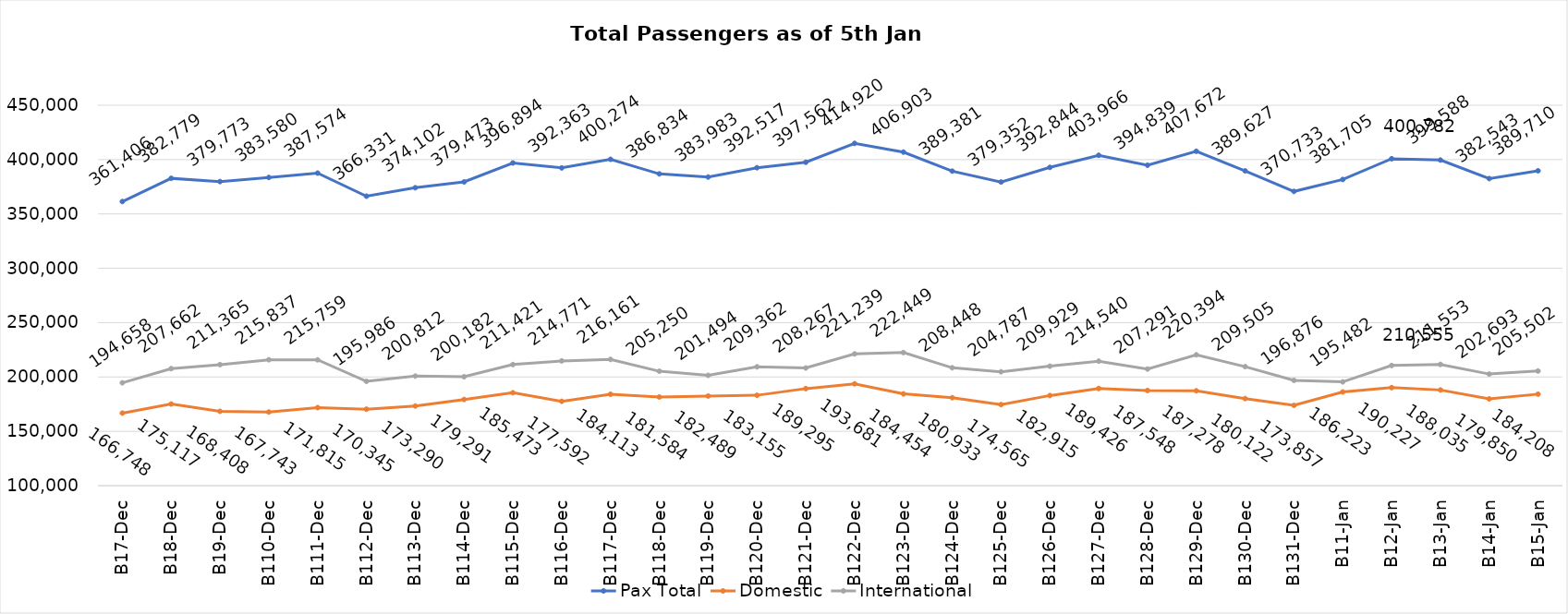
| Category | Pax Total | Domestic | International |
|---|---|---|---|
| 2023-12-07 | 361406 | 166748 | 194658 |
| 2023-12-08 | 382779 | 175117 | 207662 |
| 2023-12-09 | 379773 | 168408 | 211365 |
| 2023-12-10 | 383580 | 167743 | 215837 |
| 2023-12-11 | 387574 | 171815 | 215759 |
| 2023-12-12 | 366331 | 170345 | 195986 |
| 2023-12-13 | 374102 | 173290 | 200812 |
| 2023-12-14 | 379473 | 179291 | 200182 |
| 2023-12-15 | 396894 | 185473 | 211421 |
| 2023-12-16 | 392363 | 177592 | 214771 |
| 2023-12-17 | 400274 | 184113 | 216161 |
| 2023-12-18 | 386834 | 181584 | 205250 |
| 2023-12-19 | 383983 | 182489 | 201494 |
| 2023-12-20 | 392517 | 183155 | 209362 |
| 2023-12-21 | 397562 | 189295 | 208267 |
| 2023-12-22 | 414920 | 193681 | 221239 |
| 2023-12-23 | 406903 | 184454 | 222449 |
| 2023-12-24 | 389381 | 180933 | 208448 |
| 2023-12-25 | 379352 | 174565 | 204787 |
| 2023-12-26 | 392844 | 182915 | 209929 |
| 2023-12-27 | 403966 | 189426 | 214540 |
| 2023-12-28 | 394839 | 187548 | 207291 |
| 2023-12-29 | 407672 | 187278 | 220394 |
| 2023-12-30 | 389627 | 180122 | 209505 |
| 2023-12-31 | 370733 | 173857 | 196876 |
| 2024-01-01 | 381705 | 186223 | 195482 |
| 2024-01-02 | 400782 | 190227 | 210555 |
| 2024-01-03 | 399588 | 188035 | 211553 |
| 2024-01-04 | 382543 | 179850 | 202693 |
| 2024-01-05 | 389710 | 184208 | 205502 |